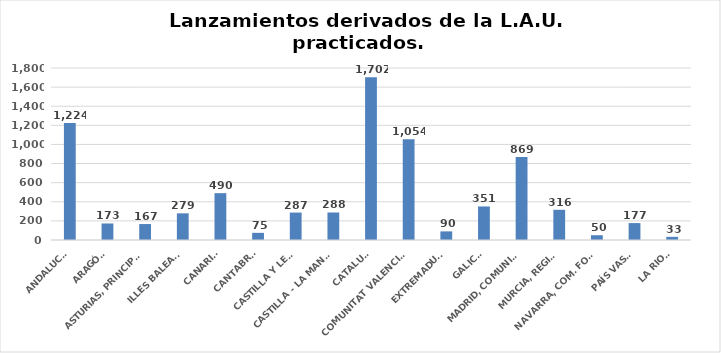
| Category | Series 0 |
|---|---|
| ANDALUCÍA | 1224 |
| ARAGÓN | 173 |
| ASTURIAS, PRINCIPADO | 167 |
| ILLES BALEARS | 279 |
| CANARIAS | 490 |
| CANTABRIA | 75 |
| CASTILLA Y LEÓN | 287 |
| CASTILLA - LA MANCHA | 288 |
| CATALUÑA | 1702 |
| COMUNITAT VALENCIANA | 1054 |
| EXTREMADURA | 90 |
| GALICIA | 351 |
| MADRID, COMUNIDAD | 869 |
| MURCIA, REGIÓN | 316 |
| NAVARRA, COM. FORAL | 50 |
| PAÍS VASCO | 177 |
| LA RIOJA | 33 |